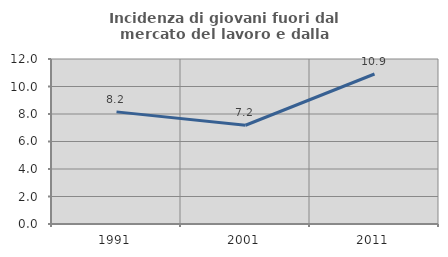
| Category | Incidenza di giovani fuori dal mercato del lavoro e dalla formazione  |
|---|---|
| 1991.0 | 8.155 |
| 2001.0 | 7.182 |
| 2011.0 | 10.909 |